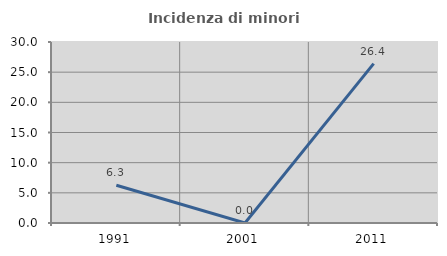
| Category | Incidenza di minori stranieri |
|---|---|
| 1991.0 | 6.25 |
| 2001.0 | 0 |
| 2011.0 | 26.415 |